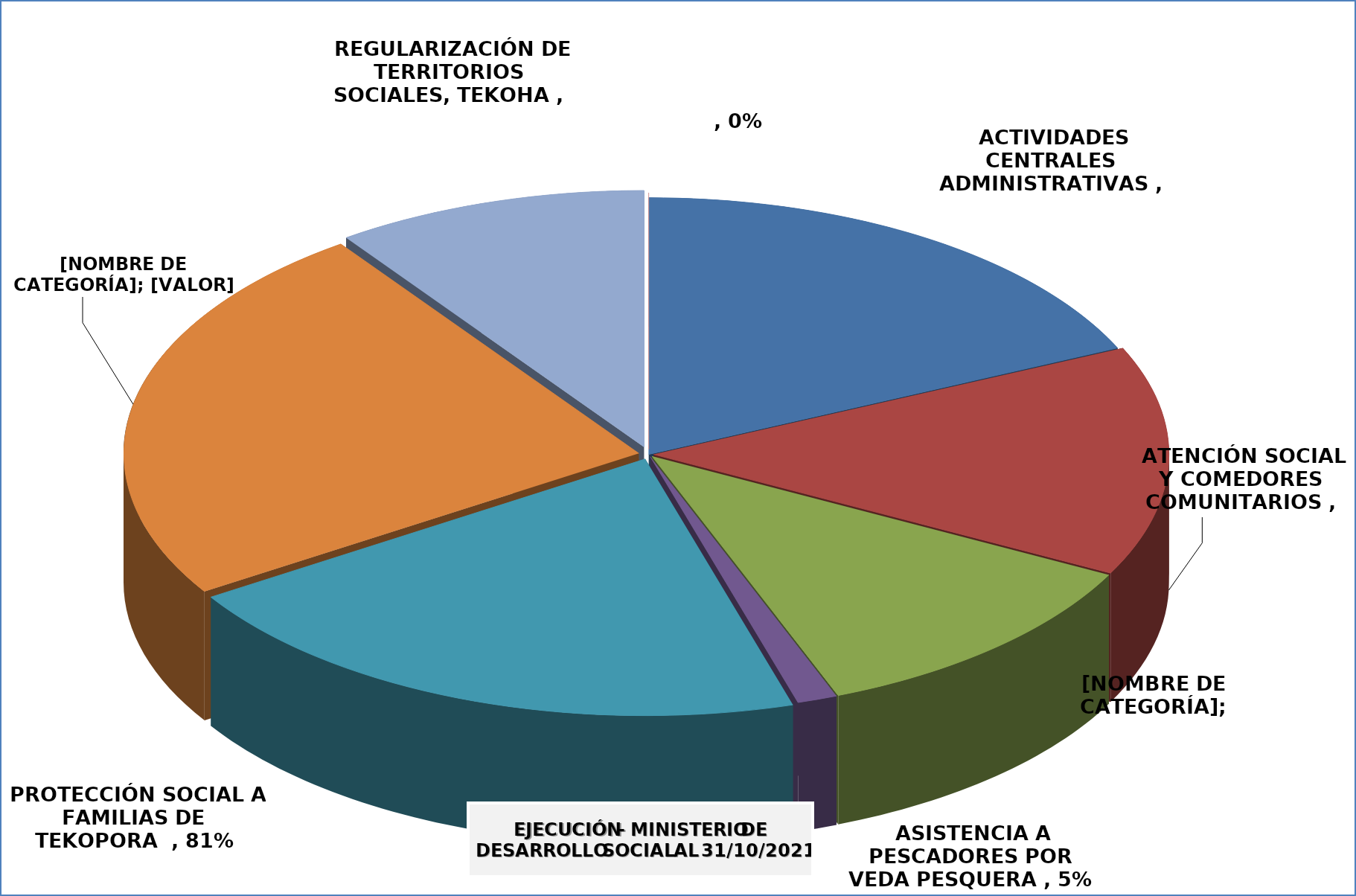
| Category | EJECUCIÓN - MINISTERIO DE DESARROLLO SOCIAL |
|---|---|
| ACTIVIDADES CENTRALES ADMINISTRATIVAS | 0.717 |
| ATENCIÓN SOCIAL Y COMEDORES COMUNITARIOS | 0.57 |
| ATENCIÓN SOCIAL Y COMEDORES COMUNITARIOS - OLLAS POPULARES -FF20 - OF 817 - COVID19 - ADICIONAL | 0.452 |
| ASISTENCIA A PESCADORES POR VEDA PESQUERA | 0.049 |
| PROTECCIÓN SOCIAL A FAMILIAS DE TEKOPORA  | 0.811 |
| FOMENTO DE MICROEMPRENDIMIENTOS A PARTICIPANTES DE TENONDERA | 0.955 |
| REGULARIZACIÓN DE TERRITORIOS SOCIALES, TEKOHA | 0.387 |